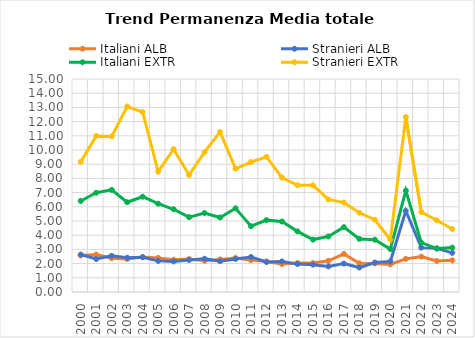
| Category | Italiani ALB | Stranieri ALB | Italiani EXTR | Stranieri EXTR |
|---|---|---|---|---|
| 2000.0 | 2.572 | 2.637 | 6.41 | 9.163 |
| 2001.0 | 2.635 | 2.326 | 6.99 | 10.987 |
| 2002.0 | 2.375 | 2.548 | 7.19 | 10.955 |
| 2003.0 | 2.318 | 2.415 | 6.323 | 13.061 |
| 2004.0 | 2.459 | 2.449 | 6.71 | 12.672 |
| 2005.0 | 2.401 | 2.192 | 6.22 | 8.481 |
| 2006.0 | 2.269 | 2.154 | 5.827 | 10.06 |
| 2007.0 | 2.32 | 2.258 | 5.27 | 8.243 |
| 2008.0 | 2.203 | 2.34 | 5.561 | 9.845 |
| 2009.0 | 2.295 | 2.172 | 5.246 | 11.273 |
| 2010.0 | 2.4 | 2.326 | 5.893 | 8.676 |
| 2011.0 | 2.251 | 2.469 | 4.632 | 9.154 |
| 2012.0 | 2.152 | 2.113 | 5.06 | 9.514 |
| 2013.0 | 1.971 | 2.151 | 4.964 | 8.057 |
| 2014.0 | 2.046 | 1.964 | 4.271 | 7.516 |
| 2015.0 | 2.037 | 1.925 | 3.691 | 7.512 |
| 2016.0 | 2.198 | 1.801 | 3.914 | 6.52 |
| 2017.0 | 2.683 | 2 | 4.566 | 6.299 |
| 2018.0 | 2.024 | 1.72 | 3.739 | 5.578 |
| 2019.0 | 2.011 | 2.076 | 3.687 | 5.088 |
| 2020.0 | 1.946 | 2.151 | 3.024 | 3.685 |
| 2021.0 | 2.333 | 5.713 | 7.146 | 12.322 |
| 2022.0 | 2.49 | 3.124 | 3.472 | 5.636 |
| 2023.0 | 2.185 | 3.075 | 3.056 | 5.051 |
| 2024.0 | 2.231 | 2.755 | 3.129 | 4.439 |